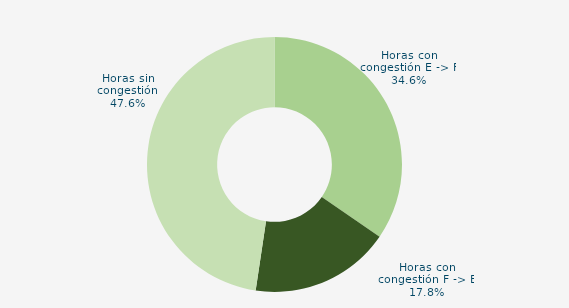
| Category | Horas con congestión E -> F |
|---|---|
| Horas con congestión E -> F | 34.583 |
| Horas con congestión F -> E | 17.778 |
| Horas sin congestión | 47.639 |